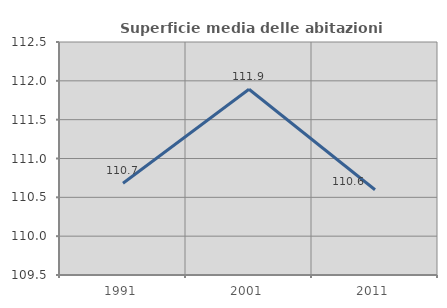
| Category | Superficie media delle abitazioni occupate |
|---|---|
| 1991.0 | 110.681 |
| 2001.0 | 111.892 |
| 2011.0 | 110.597 |